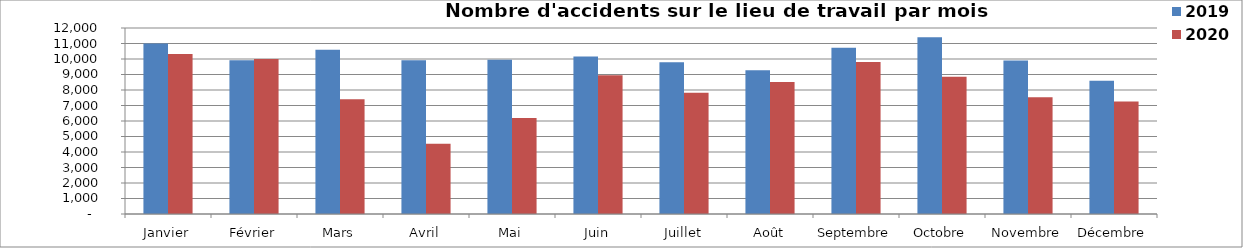
| Category | 2019 | 2020 |
|---|---|---|
| Janvier | 10994 | 10324 |
| Février | 9916 | 10005 |
| Mars | 10598 | 7409 |
| Avril | 9923 | 4528 |
| Mai | 9953 | 6186 |
| Juin | 10167 | 8950 |
| Juillet | 9792 | 7826 |
| Août | 9282 | 8514 |
| Septembre | 10733 | 9802 |
| Octobre | 11405 | 8850 |
| Novembre | 9896 | 7525 |
| Décembre | 8604 | 7254 |